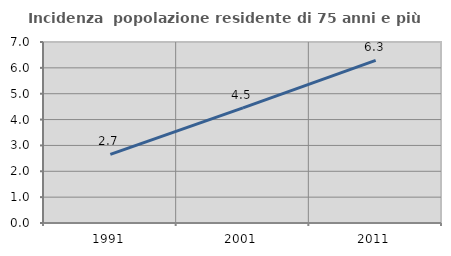
| Category | Incidenza  popolazione residente di 75 anni e più |
|---|---|
| 1991.0 | 2.652 |
| 2001.0 | 4.453 |
| 2011.0 | 6.29 |